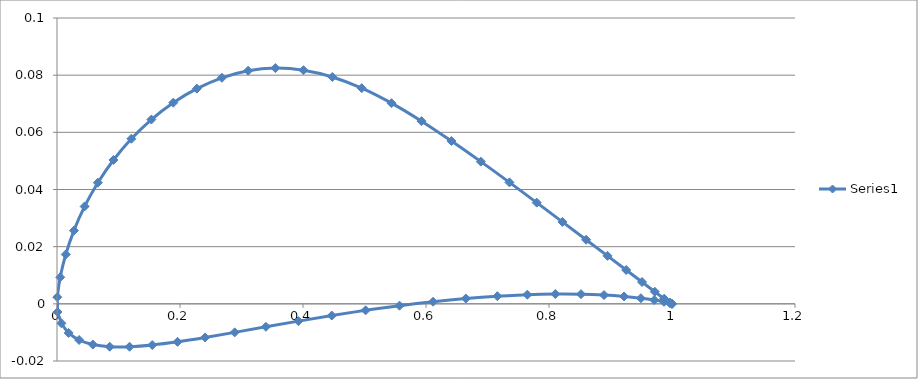
| Category | Series 0 |
|---|---|
| 1.0 | 0 |
| 0.99677 | 0 |
| 0.98729 | 0.002 |
| 0.97198 | 0.004 |
| 0.95128 | 0.008 |
| 0.92554 | 0.012 |
| 0.8951 | 0.017 |
| 0.86035 | 0.022 |
| 0.82183 | 0.029 |
| 0.78007 | 0.035 |
| 0.73567 | 0.042 |
| 0.68922 | 0.05 |
| 0.64136 | 0.057 |
| 0.59272 | 0.064 |
| 0.54394 | 0.07 |
| 0.49549 | 0.075 |
| 0.44767 | 0.079 |
| 0.40077 | 0.082 |
| 0.35505 | 0.082 |
| 0.31078 | 0.082 |
| 0.26813 | 0.079 |
| 0.22742 | 0.075 |
| 0.18906 | 0.07 |
| 0.15345 | 0.064 |
| 0.12094 | 0.058 |
| 0.09185 | 0.05 |
| 0.06643 | 0.042 |
| 0.04493 | 0.034 |
| 0.02748 | 0.026 |
| 0.01423 | 0.017 |
| 0.00519 | 0.009 |
| 0.00044 | 0.002 |
| 0.00091 | -0.003 |
| 0.00717 | -0.007 |
| 0.0189 | -0.01 |
| 0.03596 | -0.013 |
| 0.05827 | -0.014 |
| 0.08569 | -0.015 |
| 0.118 | -0.015 |
| 0.1549 | -0.014 |
| 0.19599 | -0.013 |
| 0.24083 | -0.012 |
| 0.28892 | -0.01 |
| 0.33968 | -0.008 |
| 0.39252 | -0.006 |
| 0.44679 | -0.004 |
| 0.50182 | -0.002 |
| 0.55694 | -0.001 |
| 0.61147 | 0.001 |
| 0.66472 | 0.002 |
| 0.71602 | 0.003 |
| 0.76475 | 0.003 |
| 0.81027 | 0.003 |
| 0.85202 | 0.003 |
| 0.88944 | 0.003 |
| 0.92205 | 0.003 |
| 0.94942 | 0.002 |
| 0.97118 | 0.001 |
| 0.98705 | 0.001 |
| 0.99674 | 0 |
| 1.0 | 0 |